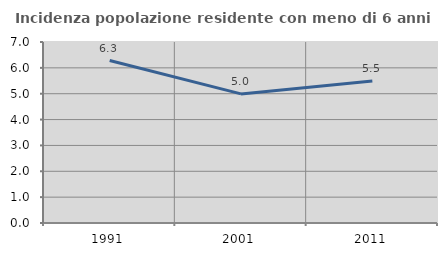
| Category | Incidenza popolazione residente con meno di 6 anni |
|---|---|
| 1991.0 | 6.282 |
| 2001.0 | 4.992 |
| 2011.0 | 5.492 |